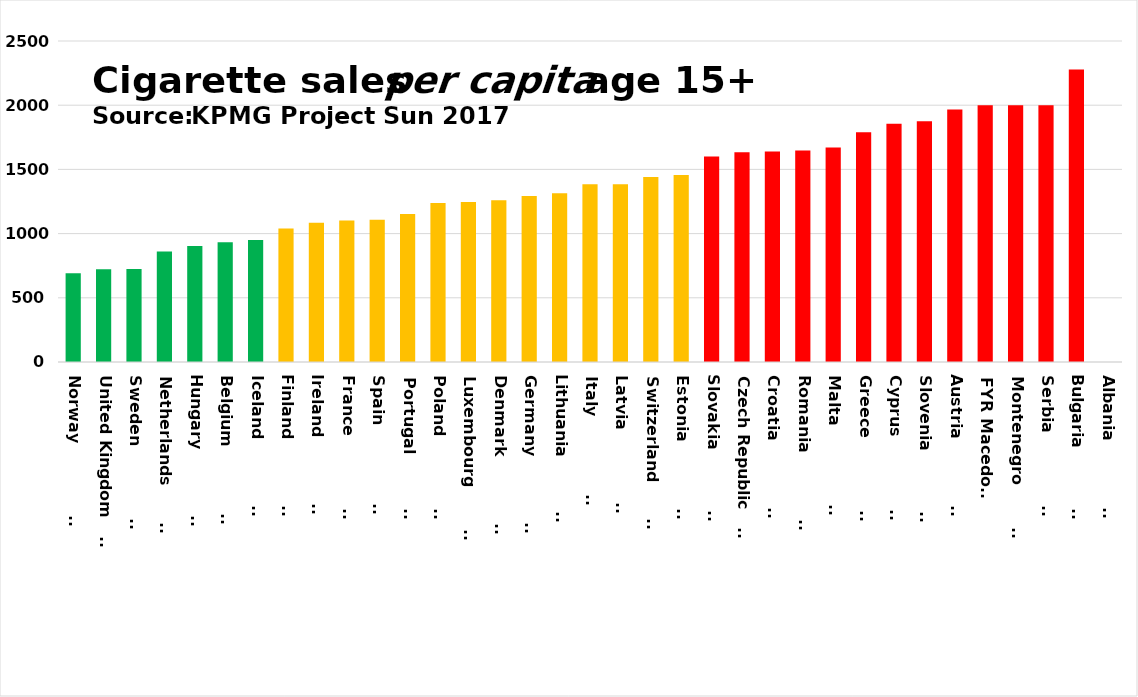
| Category | Series 0 |
|---|---|
| Norway                 | 691.648 |
| United Kingdom         | 721.485 |
| Sweden                 | 724.15 |
| Netherlands            | 860.755 |
| Hungary                | 904.003 |
| Belgium                | 932.332 |
| Iceland                | 950 |
| Finland                | 1039.415 |
| Ireland                | 1083.701 |
| France                 | 1101.566 |
| Spain                  | 1107.617 |
| Portugal               | 1152.346 |
| Poland                 | 1238.486 |
| Luxembourg             | 1245.487 |
| Denmark                | 1259.777 |
| Germany                | 1293.627 |
| Lithuania              | 1314.748 |
| Italy                  | 1384.549 |
| Latvia                 | 1385.188 |
| Switzerland            | 1441.315 |
| Estonia                | 1456.746 |
| Slovakia               | 1600.446 |
| Czech Republic         | 1634.01 |
| Croatia                | 1639.025 |
| Romania                | 1647.413 |
| Malta                  | 1670.423 |
| Greece                 | 1788.748 |
| Cyprus                 | 1855.367 |
| Slovenia               | 1874.151 |
| Austria                | 1967.04 |
| FYR Macedonia | 2000 |
| Montenegro             | 2000 |
| Serbia                 | 2000 |
| Bulgaria               | 2277.156 |
| Albania                | 0 |